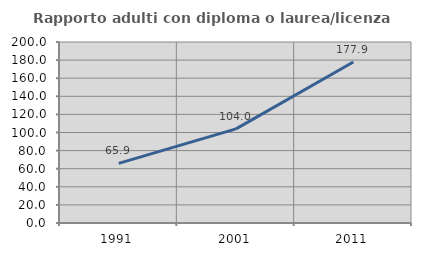
| Category | Rapporto adulti con diploma o laurea/licenza media  |
|---|---|
| 1991.0 | 65.942 |
| 2001.0 | 104 |
| 2011.0 | 177.885 |